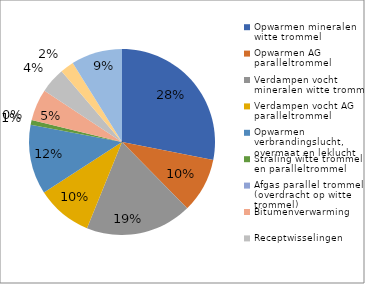
| Category | Series 0 |
|---|---|
| Opwarmen mineralen witte trommel | 18.447 |
| Opwarmen AG paralleltrommel | 6.268 |
| Verdampen vocht mineralen witte trommel | 12.149 |
| Verdampen vocht AG paralleltrommel | 6.375 |
| Opwarmen verbrandingslucht, overmaat en leklucht  | 7.946 |
| Straling witte trommel en paralleltrommel | 0.557 |
| Afgas parallel trommel (overdracht op witte trommel) | 0 |
| Bitumenverwarming | 3.6 |
| Receptwisselingen | 2.918 |
| Starts en stops | 1.556 |
| Elektriciteit (overig) | 5.833 |